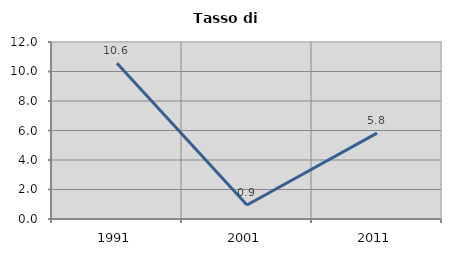
| Category | Tasso di disoccupazione   |
|---|---|
| 1991.0 | 10.553 |
| 2001.0 | 0.948 |
| 2011.0 | 5.82 |